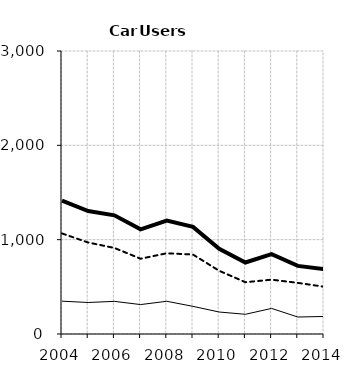
| Category | Built-up | Non built-up | Total |
|---|---|---|---|
| 2004.0 | 348 | 1066 | 1414 |
| 2005.0 | 334 | 970 | 1304 |
| 2006.0 | 346 | 912 | 1258 |
| 2007.0 | 312 | 798 | 1110 |
| 2008.0 | 347 | 856 | 1203 |
| 2009.0 | 293 | 842 | 1135 |
| 2010.0 | 233 | 670 | 903 |
| 2011.0 | 209 | 549 | 758 |
| 2012.0 | 271 | 576 | 847 |
| 2013.0 | 180 | 542 | 722 |
| 2014.0 | 186 | 501 | 687 |